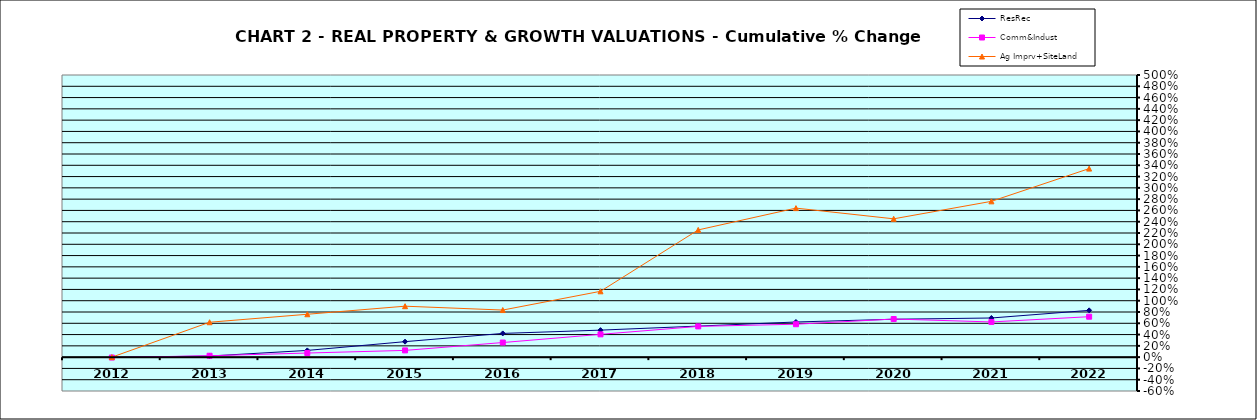
| Category | ResRec | Comm&Indust | Ag Imprv+SiteLand |
|---|---|---|---|
| 2012.0 | -0.004 | -0.007 | 0 |
| 2013.0 | 0.02 | 0.025 | 0.618 |
| 2014.0 | 0.119 | 0.073 | 0.76 |
| 2015.0 | 0.274 | 0.12 | 0.903 |
| 2016.0 | 0.42 | 0.259 | 0.835 |
| 2017.0 | 0.479 | 0.404 | 1.167 |
| 2018.0 | 0.55 | 0.545 | 2.255 |
| 2019.0 | 0.623 | 0.583 | 2.641 |
| 2020.0 | 0.672 | 0.675 | 2.451 |
| 2021.0 | 0.694 | 0.624 | 2.761 |
| 2022.0 | 0.829 | 0.717 | 3.341 |